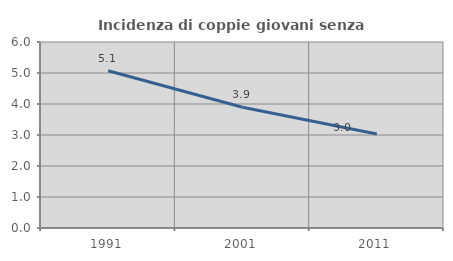
| Category | Incidenza di coppie giovani senza figli |
|---|---|
| 1991.0 | 5.072 |
| 2001.0 | 3.896 |
| 2011.0 | 3.03 |